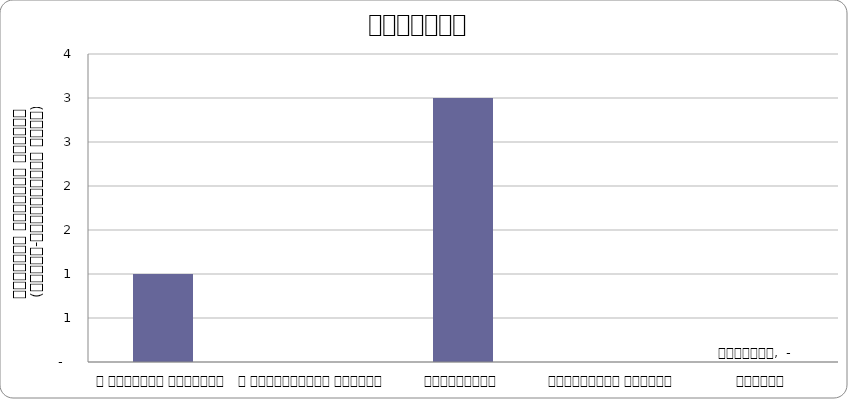
| Category | आन्दोलन |
|---|---|
| द हिमालयन टाइम्स् | 1 |
| द काठमाण्डौं पोस्ट् | 0 |
| कान्तिपुर | 3 |
| अन्नपूर्ण पोस्ट् | 0 |
| नागरिक | 0 |